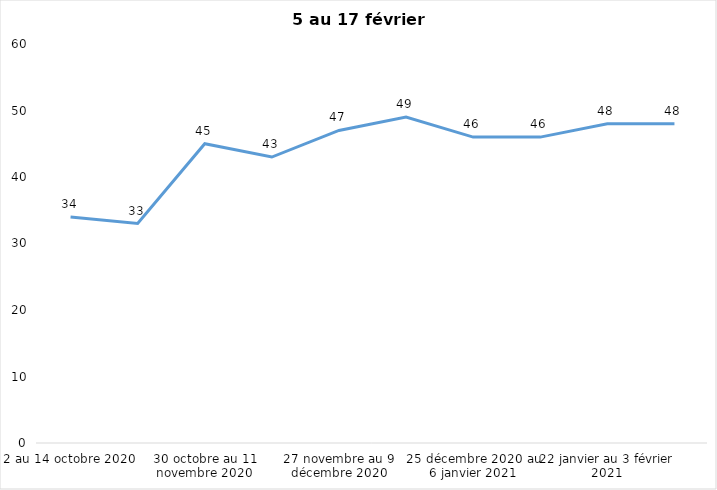
| Category | Toujours aux trois mesures |
|---|---|
| 2 au 14 octobre 2020 | 34 |
| 16 au 28 octobre 2020 | 33 |
| 30 octobre au 11 novembre 2020 | 45 |
| 13 au 25 novembre 2020 | 43 |
| 27 novembre au 9 décembre 2020 | 47 |
| 11 au 25 décembre 2020 | 49 |
| 25 décembre 2020 au 6 janvier 2021 | 46 |
| 8 au 20 janvier 2021 | 46 |
| 22 janvier au 3 février 2021 | 48 |
| 5 au 17 février 2021 | 48 |